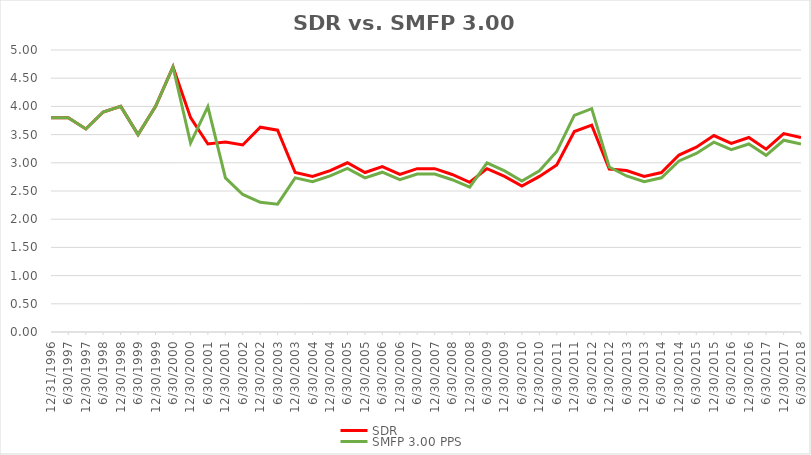
| Category | SDR | SMFP 3.00 PPS |
|---|---|---|
| 12/31/96 | 3.8 | 3.8 |
| 6/30/97 | 3.8 | 3.8 |
| 12/31/97 | 3.6 | 3.6 |
| 6/30/98 | 3.9 | 3.9 |
| 12/31/98 | 4 | 4 |
| 6/30/99 | 3.5 | 3.5 |
| 12/31/99 | 4 | 4 |
| 6/30/00 | 4.7 | 4.7 |
| 12/31/00 | 3.8 | 3.35 |
| 6/30/01 | 3.333 | 3.995 |
| 12/31/01 | 3.368 | 2.732 |
| 6/30/02 | 3.316 | 2.438 |
| 12/31/02 | 3.632 | 2.3 |
| 6/30/03 | 3.579 | 2.267 |
| 12/31/03 | 2.828 | 2.733 |
| 6/30/04 | 2.759 | 2.667 |
| 12/31/04 | 2.862 | 2.767 |
| 6/30/05 | 3 | 2.9 |
| 12/31/05 | 2.828 | 2.733 |
| 6/30/06 | 2.931 | 2.833 |
| 12/31/06 | 2.793 | 2.7 |
| 6/30/07 | 2.897 | 2.8 |
| 12/31/07 | 2.897 | 2.8 |
| 6/30/08 | 2.793 | 2.7 |
| 12/31/08 | 2.655 | 2.567 |
| 6/30/09 | 2.897 | 3 |
| 12/31/09 | 2.759 | 2.857 |
| 6/30/10 | 2.586 | 2.679 |
| 12/31/10 | 2.759 | 2.857 |
| 6/30/11 | 2.963 | 3.2 |
| 12/31/11 | 3.556 | 3.84 |
| 6/30/12 | 3.667 | 3.96 |
| 12/31/12 | 2.889 | 2.925 |
| 6/30/13 | 2.862 | 2.767 |
| 12/31/13 | 2.759 | 2.667 |
| 6/30/14 | 2.828 | 2.733 |
| 12/31/14 | 3.138 | 3.033 |
| 6/30/15 | 3.276 | 3.167 |
| 12/31/15 | 3.483 | 3.367 |
| 6/30/16 | 3.345 | 3.233 |
| 12/31/16 | 3.448 | 3.333 |
| 6/30/17 | 3.241 | 3.133 |
| 12/31/17 | 3.517 | 3.4 |
| 6/30/18 | 3.448 | 3.333 |